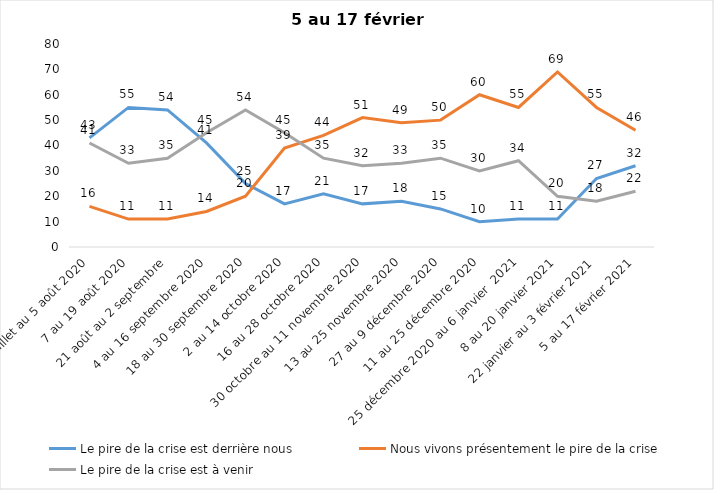
| Category | Le pire de la crise est derrière nous | Nous vivons présentement le pire de la crise | Le pire de la crise est à venir |
|---|---|---|---|
| 24 juillet au 5 août 2020 | 43 | 16 | 41 |
| 7 au 19 août 2020 | 55 | 11 | 33 |
| 21 août au 2 septembre | 54 | 11 | 35 |
| 4 au 16 septembre 2020 | 41 | 14 | 45 |
| 18 au 30 septembre 2020 | 25 | 20 | 54 |
| 2 au 14 octobre 2020 | 17 | 39 | 45 |
| 16 au 28 octobre 2020 | 21 | 44 | 35 |
| 30 octobre au 11 novembre 2020 | 17 | 51 | 32 |
| 13 au 25 novembre 2020 | 18 | 49 | 33 |
| 27 au 9 décembre 2020 | 15 | 50 | 35 |
| 11 au 25 décembre 2020 | 10 | 60 | 30 |
| 25 décembre 2020 au 6 janvier  2021 | 11 | 55 | 34 |
| 8 au 20 janvier 2021 | 11 | 69 | 20 |
| 22 janvier au 3 février 2021 | 27 | 55 | 18 |
| 5 au 17 février 2021 | 32 | 46 | 22 |